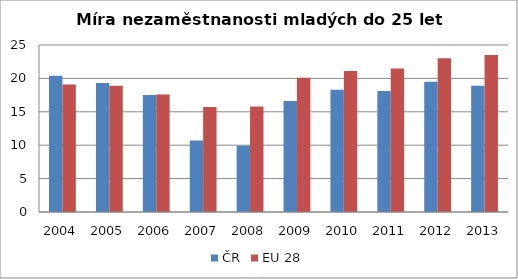
| Category | ČR | EU 28 |
|---|---|---|
| 2004 | 20.4 | 19.1 |
| 2005 | 19.3 | 18.9 |
| 2006 | 17.5 | 17.6 |
| 2007 | 10.7 | 15.7 |
| 2008 | 9.9 | 15.8 |
| 2009 | 16.6 | 20.1 |
| 2010 | 18.3 | 21.1 |
| 2011 | 18.1 | 21.5 |
| 2012 | 19.5 | 23 |
| 2013 | 18.9 | 23.5 |